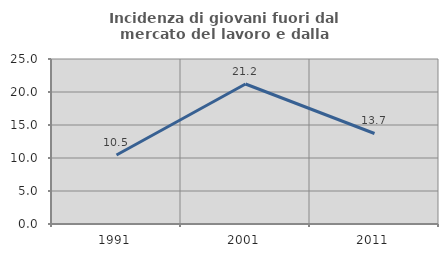
| Category | Incidenza di giovani fuori dal mercato del lavoro e dalla formazione  |
|---|---|
| 1991.0 | 10.45 |
| 2001.0 | 21.212 |
| 2011.0 | 13.714 |